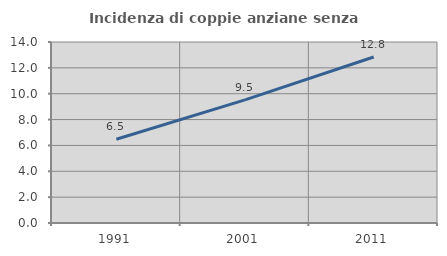
| Category | Incidenza di coppie anziane senza figli  |
|---|---|
| 1991.0 | 6.475 |
| 2001.0 | 9.521 |
| 2011.0 | 12.84 |